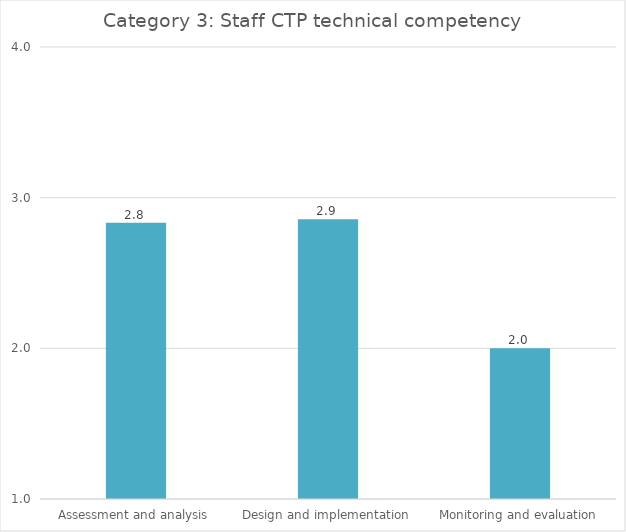
| Category |   Category 3: Staff CTP technical competency |
|---|---|
| Assessment and analysis | 2.833 |
| Design and implementation | 2.857 |
| Monitoring and evaluation | 2 |